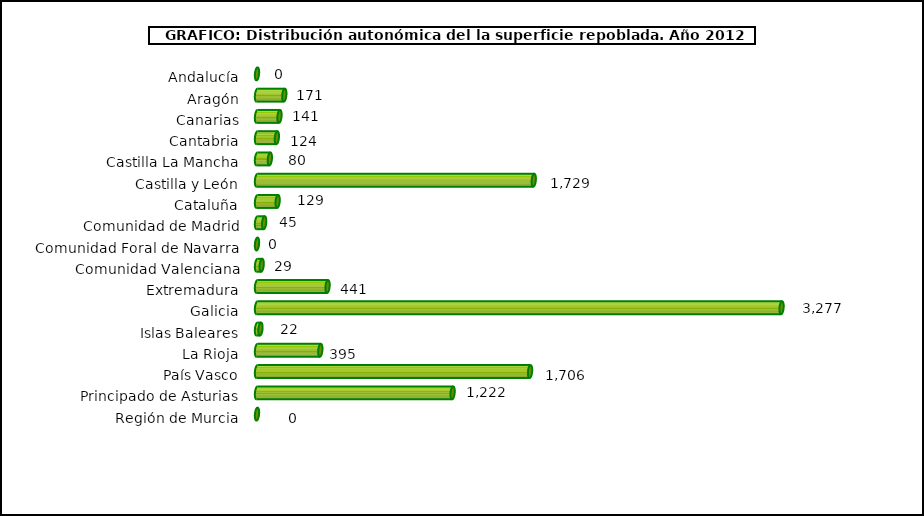
| Category | repoblacion |
|---|---|
| Andalucía | 0 |
| Aragón | 170.5 |
| Canarias | 140.54 |
| Cantabria | 124.11 |
| Castilla La Mancha | 80.22 |
| Castilla y León | 1728.75 |
| Cataluña | 128.77 |
| Comunidad de Madrid | 44.72 |
| Comunidad Foral de Navarra | 0 |
| Comunidad Valenciana | 29.1 |
| Extremadura | 440.69 |
| Galicia | 3276.7 |
| Islas Baleares | 21.61 |
| La Rioja | 395.48 |
| País Vasco | 1705.66 |
| Principado de Asturias | 1221.81 |
| Región de Murcia | 0 |